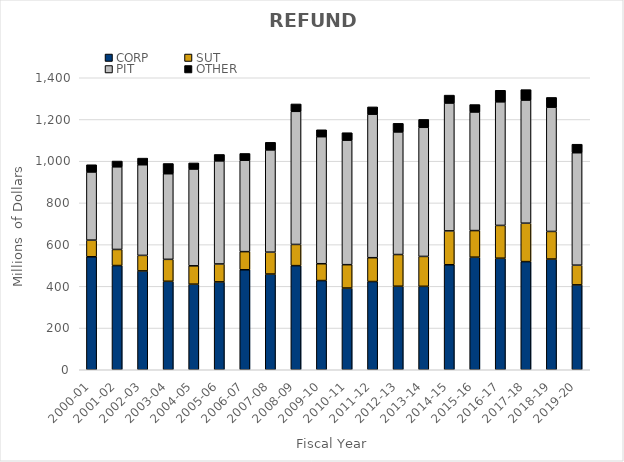
| Category | CORP | SUT | PIT | OTHER |
|---|---|---|---|---|
| 2000-01 | 541.653 | 79.905 | 326.734 | 34.724 |
| 2001-02 | 499.642 | 77.143 | 396.149 | 27.825 |
| 2002-03 | 473.864 | 74.445 | 434.509 | 31.898 |
| 2003-04 | 424.129 | 105.281 | 410.44 | 49.086 |
| 2004-05 | 410.376 | 87.897 | 464.22 | 29.181 |
| 2005-06 | 421.175 | 86.026 | 494.328 | 30.789 |
| 2006-07 | 479.343 | 87.023 | 438.366 | 32.364 |
| 2007-08 | 458.803 | 105.005 | 490.251 | 36.46 |
| 2008-09 | 499.176 | 101.687 | 638.202 | 35.41 |
| 2009-10 | 427.654 | 80.712 | 609.016 | 33.195 |
| 2010-11 | 391.716 | 112.143 | 596.947 | 35.74 |
| 2011-12 | 422.973 | 114.303 | 688.15 | 34.999 |
| 2012-13 | 400.358 | 152.119 | 587.79 | 41.276 |
| 2013-14 | 400.035 | 143.343 | 619.004 | 37.946 |
| 2014-15 | 503.471 | 162.36 | 613.021 | 37.923 |
| 2015-16 | 539.703 | 127.593 | 568.586 | 35.648 |
| 2016-17 | 534.79 | 157.26 | 592.52 | 55.431 |
| 2017-18 | 518.485 | 184.183 | 590.416 | 50.027 |
| 2018-19 | 530.734 | 132.474 | 595.866 | 46.681 |
| 2019-20 | 406.961 | 94.412 | 539.056 | 40.973 |